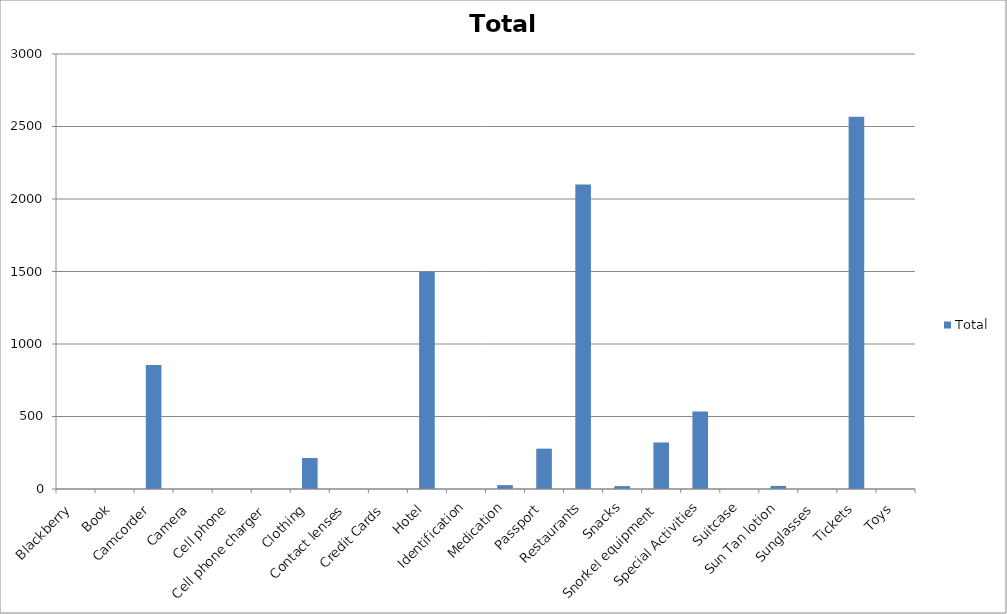
| Category | Total |
|---|---|
| Blackberry | 0 |
| Book | 0 |
| Camcorder | 856 |
| Camera | 0 |
| Cell phone | 0 |
| Cell phone charger | 0 |
| Clothing | 214 |
| Contact lenses | 0 |
| Credit Cards | 0 |
| Hotel | 1498 |
| Identification | 0 |
| Medication | 26.75 |
| Passport | 278.2 |
| Restaurants | 2100 |
| Snacks | 20 |
| Snorkel equipment | 321 |
| Special Activities | 535 |
| Suitcase | 0 |
| Sun Tan lotion | 21.4 |
| Sunglasses | 0 |
| Tickets | 2568 |
| Toys | 0 |